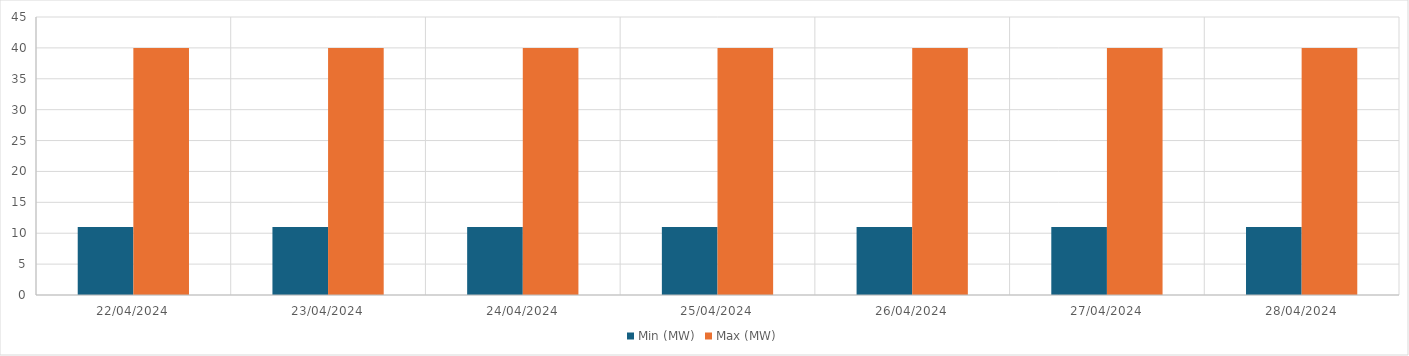
| Category | Min (MW) | Max (MW) |
|---|---|---|
| 22/04/2024 | 11 | 40 |
| 23/04/2024 | 11 | 40 |
| 24/04/2024 | 11 | 40 |
| 25/04/2024 | 11 | 40 |
| 26/04/2024 | 11 | 40 |
| 27/04/2024 | 11 | 40 |
| 28/04/2024 | 11 | 40 |